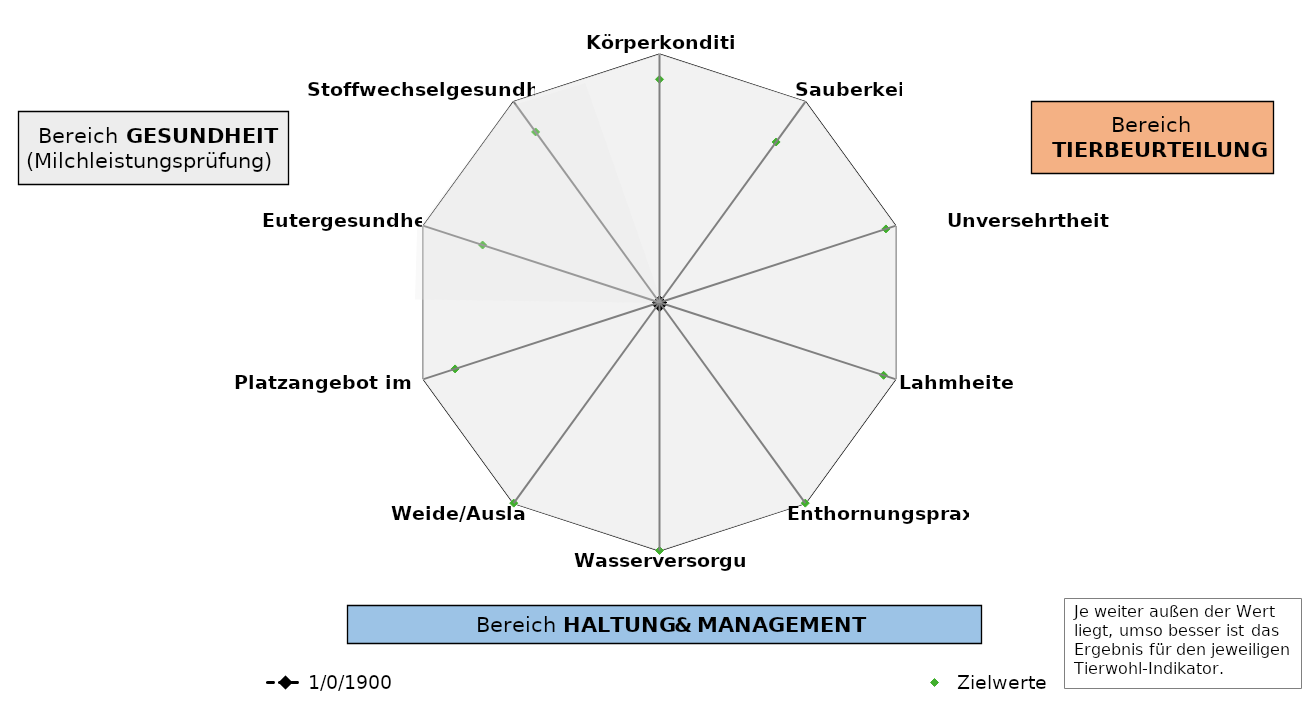
| Category | Äusserer Rand |
|---|---|
| 0 | 100 |
| 1 | 100 |
| 2 | 100 |
| 3 | 100 |
| 4 | 100 |
| 5 | 100 |
| 6 | 100 |
| 7 | 100 |
| 8 | 100 |
| 9 | 100 |